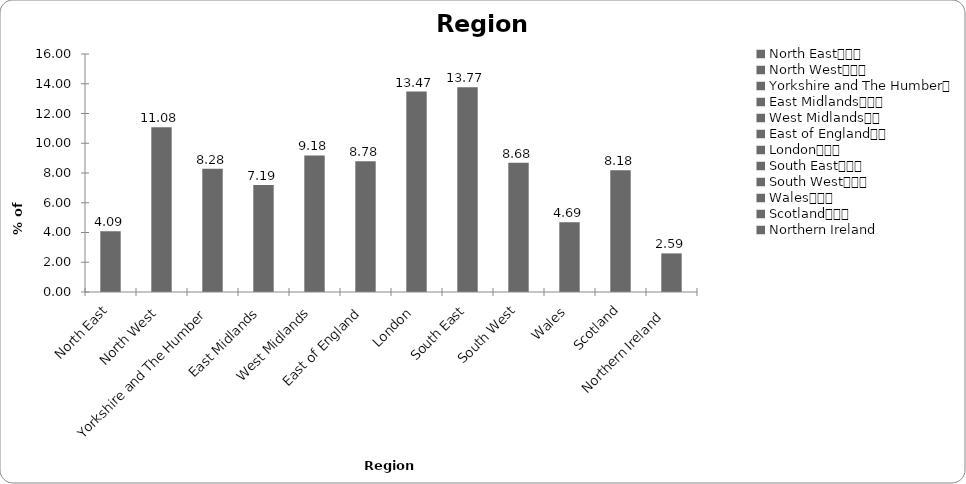
| Category | Region |
|---|---|
| North East			 | 4.092 |
| North West			 | 11.078 |
| Yorkshire and The Humber	 | 8.283 |
| East Midlands			 | 7.186 |
| West Midlands		 | 9.182 |
| East of England		 | 8.782 |
| London			 | 13.473 |
| South East			 | 13.772 |
| South West			 | 8.683 |
| Wales			 | 4.691 |
| Scotland			 | 8.184 |
| Northern Ireland  | 2.595 |